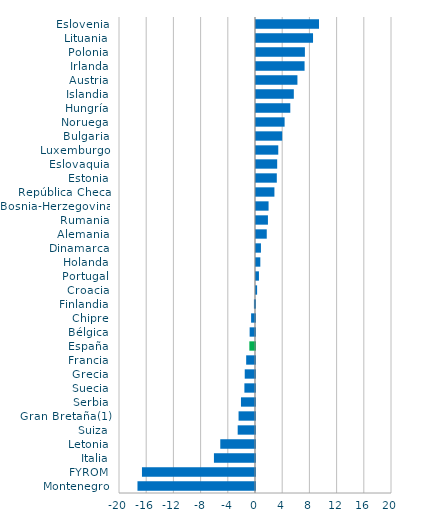
| Category | Series 0 |
|---|---|
| Montenegro | -17.282 |
| FYROM | -16.623 |
| Italia | -6.038 |
| Letonia | -5.106 |
| Suiza | -2.546 |
| Gran Bretaña(1) | -2.418 |
| Serbia | -2.064 |
| Suecia | -1.559 |
| Grecia | -1.51 |
| Francia | -1.297 |
| España | -0.831 |
| Bélgica | -0.79 |
| Chipre | -0.572 |
| Finlandia | -0.159 |
| Croacia | 0.162 |
| Portugal | 0.432 |
| Holanda | 0.635 |
| Dinamarca | 0.727 |
| Alemania | 1.582 |
| Rumania | 1.755 |
| Bosnia-Herzegovina | 1.848 |
| República Checa | 2.708 |
| Estonia | 3.06 |
| Eslovaquia | 3.115 |
| Luxemburgo | 3.275 |
| Bulgaria | 3.854 |
| Noruega | 4.207 |
| Hungría | 5.044 |
| Islandia | 5.561 |
| Austria | 6.092 |
| Irlanda | 7.143 |
| Polonia | 7.19 |
| Lituania | 8.387 |
| Eslovenia | 9.265 |